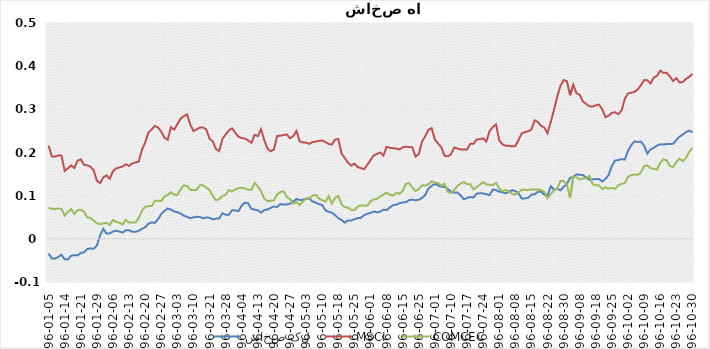
| Category | شاخص کل | MSCI | COMCEC |
|---|---|---|---|
| 1396-01-05 | -0.034 | 0.216 | 0.071 |
| 1396-01-06 | -0.046 | 0.191 | 0.07 |
| 1396-01-07 | -0.046 | 0.19 | 0.069 |
| 1396-01-08 | -0.042 | 0.193 | 0.07 |
| 1396-01-09 | -0.037 | 0.193 | 0.069 |
| 1396-01-14 | -0.047 | 0.157 | 0.054 |
| 1396-01-15 | -0.048 | 0.163 | 0.062 |
| 1396-01-16 | -0.039 | 0.17 | 0.069 |
| 1396-01-19 | -0.038 | 0.164 | 0.058 |
| 1396-01-20 | -0.038 | 0.181 | 0.066 |
| 1396-01-21 | -0.033 | 0.184 | 0.067 |
| 1396-01-23 | -0.031 | 0.171 | 0.063 |
| 1396-01-26 | -0.024 | 0.17 | 0.05 |
| 1396-01-27 | -0.022 | 0.167 | 0.048 |
| 1396-01-28 | -0.023 | 0.159 | 0.042 |
| 1396-01-29 | -0.016 | 0.135 | 0.036 |
| 1396-01-30 | 0.009 | 0.129 | 0.034 |
| 1396-02-02 | 0.023 | 0.142 | 0.036 |
| 1396-02-03 | 0.012 | 0.147 | 0.037 |
| 1396-02-04 | 0.013 | 0.139 | 0.032 |
| 1396-02-06 | 0.017 | 0.157 | 0.044 |
| 1396-02-09 | 0.019 | 0.163 | 0.039 |
| 1396-02-10 | 0.017 | 0.165 | 0.037 |
| 1396-02-11 | 0.014 | 0.167 | 0.033 |
| 1396-02-12 | 0.02 | 0.173 | 0.044 |
| 1396-02-13 | 0.02 | 0.169 | 0.038 |
| 1396-02-16 | 0.016 | 0.175 | 0.038 |
| 1396-02-17 | 0.016 | 0.177 | 0.038 |
| 1396-02-18 | 0.019 | 0.179 | 0.048 |
| 1396-02-19 | 0.023 | 0.206 | 0.065 |
| 1396-02-20 | 0.027 | 0.223 | 0.074 |
| 1396-02-23 | 0.035 | 0.246 | 0.076 |
| 1396-02-24 | 0.038 | 0.254 | 0.076 |
| 1396-02-25 | 0.037 | 0.261 | 0.087 |
| 1396-02-26 | 0.046 | 0.258 | 0.088 |
| 1396-02-27 | 0.057 | 0.248 | 0.087 |
| 1396-02-30 | 0.065 | 0.234 | 0.098 |
| 1396-02-31 | 0.07 | 0.229 | 0.102 |
| 1396-03-01 | 0.068 | 0.259 | 0.108 |
| 1396-03-02 | 0.063 | 0.253 | 0.103 |
| 1396-03-03 | 0.062 | 0.265 | 0.102 |
| 1396-03-06 | 0.059 | 0.278 | 0.115 |
| 1396-03-07 | 0.054 | 0.284 | 0.124 |
| 1396-03-08 | 0.051 | 0.288 | 0.123 |
| 1396-03-09 | 0.048 | 0.265 | 0.114 |
| 1396-03-10 | 0.05 | 0.25 | 0.113 |
| 1396-03-13 | 0.051 | 0.254 | 0.114 |
| 1396-03-16 | 0.051 | 0.258 | 0.124 |
| 1396-03-17 | 0.047 | 0.258 | 0.124 |
| 1396-03-20 | 0.05 | 0.253 | 0.119 |
| 1396-03-21 | 0.049 | 0.232 | 0.113 |
| 1396-03-22 | 0.045 | 0.226 | 0.1 |
| 1396-03-23 | 0.047 | 0.208 | 0.089 |
| 1396-03-24 | 0.047 | 0.203 | 0.092 |
| 1396-03-27 | 0.059 | 0.232 | 0.099 |
| 1396-03-28 | 0.056 | 0.241 | 0.102 |
| 1396-03-29 | 0.056 | 0.251 | 0.113 |
| 1396-03-30 | 0.066 | 0.256 | 0.11 |
| 1396-03-31 | 0.066 | 0.245 | 0.114 |
| 1396-04-03 | 0.064 | 0.236 | 0.117 |
| 1396-04-04 | 0.077 | 0.233 | 0.118 |
| 1396-04-07 | 0.084 | 0.233 | 0.117 |
| 1396-04-10 | 0.082 | 0.228 | 0.114 |
| 1396-04-11 | 0.07 | 0.222 | 0.113 |
| 1396-04-12 | 0.068 | 0.241 | 0.13 |
| 1396-04-13 | 0.066 | 0.238 | 0.121 |
| 1396-04-14 | 0.061 | 0.254 | 0.11 |
| 1396-04-17 | 0.067 | 0.228 | 0.093 |
| 1396-04-18 | 0.068 | 0.209 | 0.087 |
| 1396-04-19 | 0.072 | 0.203 | 0.088 |
| 1396-04-20 | 0.075 | 0.207 | 0.089 |
| 1396-04-21 | 0.074 | 0.238 | 0.103 |
| 1396-04-24 | 0.081 | 0.239 | 0.108 |
| 1396-04-25 | 0.079 | 0.24 | 0.11 |
| 1396-04-26 | 0.08 | 0.242 | 0.097 |
| 1396-04-27 | 0.081 | 0.233 | 0.092 |
| 1396-04-28 | 0.087 | 0.238 | 0.082 |
| 1396-04-31 | 0.092 | 0.25 | 0.085 |
| 1396-05-01 | 0.09 | 0.226 | 0.079 |
| 1396-05-02 | 0.091 | 0.223 | 0.087 |
| 1396-05-03 | 0.092 | 0.223 | 0.093 |
| 1396-05-04 | 0.094 | 0.22 | 0.094 |
| 1396-05-07 | 0.087 | 0.224 | 0.1 |
| 1396-05-08 | 0.084 | 0.225 | 0.102 |
| 1396-05-09 | 0.08 | 0.227 | 0.093 |
| 1396-05-10 | 0.078 | 0.228 | 0.09 |
| 1396-05-11 | 0.066 | 0.224 | 0.086 |
| 1396-05-15 | 0.063 | 0.22 | 0.099 |
| 1396-05-16 | 0.061 | 0.218 | 0.082 |
| 1396-05-17 | 0.055 | 0.23 | 0.095 |
| 1396-05-18 | 0.047 | 0.231 | 0.1 |
| 1396-05-21 | 0.044 | 0.198 | 0.08 |
| 1396-05-22 | 0.038 | 0.187 | 0.074 |
| 1396-05-23 | 0.043 | 0.177 | 0.072 |
| 1396-05-24 | 0.042 | 0.17 | 0.067 |
| 1396-05-25 | 0.045 | 0.174 | 0.067 |
| 1396-05-28 | 0.048 | 0.166 | 0.075 |
| 1396-05-29 | 0.049 | 0.164 | 0.077 |
| 1396-05-30 | 0.055 | 0.161 | 0.077 |
| 1396-05-31 | 0.058 | 0.171 | 0.077 |
| 1396-06-01 | 0.06 | 0.182 | 0.087 |
| 1396-06-04 | 0.063 | 0.193 | 0.091 |
| 1396-06-05 | 0.061 | 0.196 | 0.093 |
| 1396-06-06 | 0.063 | 0.2 | 0.099 |
| 1396-06-07 | 0.068 | 0.193 | 0.102 |
| 1396-06-08 | 0.066 | 0.213 | 0.107 |
| 1396-06-11 | 0.073 | 0.211 | 0.102 |
| 1396-06-12 | 0.078 | 0.21 | 0.1 |
| 1396-06-13 | 0.079 | 0.209 | 0.106 |
| 1396-06-14 | 0.082 | 0.207 | 0.105 |
| 1396-06-15 | 0.084 | 0.212 | 0.111 |
| 1396-06-19 | 0.085 | 0.213 | 0.128 |
| 1396-06-20 | 0.09 | 0.213 | 0.129 |
| 1396-06-21 | 0.091 | 0.212 | 0.118 |
| 1396-06-22 | 0.089 | 0.191 | 0.111 |
| 1396-06-25 | 0.09 | 0.196 | 0.115 |
| 1396-06-26 | 0.095 | 0.225 | 0.124 |
| 1396-06-27 | 0.101 | 0.237 | 0.123 |
| 1396-06-28 | 0.116 | 0.252 | 0.126 |
| 1396-06-29 | 0.123 | 0.256 | 0.133 |
| 1396-07-01 | 0.127 | 0.23 | 0.13 |
| 1396-07-02 | 0.124 | 0.221 | 0.129 |
| 1396-07-03 | 0.121 | 0.212 | 0.124 |
| 1396-07-04 | 0.12 | 0.193 | 0.128 |
| 1396-07-05 | 0.116 | 0.191 | 0.109 |
| 1396-07-10 | 0.109 | 0.196 | 0.106 |
| 1396-07-11 | 0.107 | 0.212 | 0.114 |
| 1396-07-12 | 0.107 | 0.209 | 0.122 |
| 1396-07-15 | 0.101 | 0.207 | 0.128 |
| 1396-07-16 | 0.091 | 0.207 | 0.132 |
| 1396-07-17 | 0.095 | 0.207 | 0.127 |
| 1396-07-18 | 0.097 | 0.22 | 0.126 |
| 1396-07-19 | 0.096 | 0.22 | 0.114 |
| 1396-07-22 | 0.105 | 0.23 | 0.12 |
| 1396-07-23 | 0.106 | 0.231 | 0.126 |
| 1396-07-24 | 0.105 | 0.233 | 0.131 |
| 1396-07-25 | 0.103 | 0.225 | 0.126 |
| 1396-07-26 | 0.101 | 0.25 | 0.125 |
| 1396-07-29 | 0.114 | 0.259 | 0.124 |
| 1396-07-30 | 0.113 | 0.265 | 0.129 |
| 1396-08-01 | 0.109 | 0.228 | 0.117 |
| 1396-08-02 | 0.108 | 0.219 | 0.11 |
| 1396-08-03 | 0.105 | 0.216 | 0.113 |
| 1396-08-06 | 0.109 | 0.215 | 0.109 |
| 1396-08-07 | 0.113 | 0.214 | 0.104 |
| 1396-08-08 | 0.111 | 0.215 | 0.102 |
| 1396-08-09 | 0.105 | 0.229 | 0.108 |
| 1396-08-10 | 0.093 | 0.244 | 0.114 |
| 1396-08-13 | 0.094 | 0.247 | 0.114 |
| 1396-08-14 | 0.095 | 0.249 | 0.113 |
| 1396-08-15 | 0.103 | 0.253 | 0.115 |
| 1396-08-16 | 0.103 | 0.274 | 0.114 |
| 1396-08-17 | 0.109 | 0.271 | 0.114 |
| 1396-08-20 | 0.109 | 0.262 | 0.113 |
| 1396-08-21 | 0.102 | 0.258 | 0.109 |
| 1396-08-22 | 0.1 | 0.245 | 0.094 |
| 1396-08-23 | 0.122 | 0.271 | 0.103 |
| 1396-08-24 | 0.114 | 0.299 | 0.113 |
| 1396-08-27 | 0.116 | 0.329 | 0.116 |
| 1396-08-29 | 0.112 | 0.354 | 0.134 |
| 1396-08-30 | 0.12 | 0.368 | 0.134 |
| 1396-09-01 | 0.127 | 0.365 | 0.127 |
| 1396-09-04 | 0.141 | 0.333 | 0.094 |
| 1396-09-05 | 0.143 | 0.357 | 0.144 |
| 1396-09-07 | 0.149 | 0.337 | 0.143 |
| 1396-09-08 | 0.148 | 0.334 | 0.138 |
| 1396-09-11 | 0.148 | 0.318 | 0.14 |
| 1396-09-12 | 0.142 | 0.313 | 0.141 |
| 1396-09-13 | 0.136 | 0.307 | 0.146 |
| 1396-09-14 | 0.138 | 0.307 | 0.126 |
| 1396-09-18 | 0.139 | 0.309 | 0.124 |
| 1396-09-19 | 0.139 | 0.311 | 0.124 |
| 1396-09-20 | 0.133 | 0.3 | 0.116 |
| 1396-09-21 | 0.139 | 0.282 | 0.119 |
| 1396-09-22 | 0.148 | 0.285 | 0.117 |
| 1396-09-25 | 0.169 | 0.292 | 0.118 |
| 1396-09-26 | 0.181 | 0.293 | 0.116 |
| 1396-09-27 | 0.183 | 0.289 | 0.124 |
| 1396-09-28 | 0.185 | 0.297 | 0.128 |
| 1396-09-29 | 0.183 | 0.324 | 0.129 |
| 1396-10-02 | 0.204 | 0.337 | 0.144 |
| 1396-10-03 | 0.217 | 0.338 | 0.148 |
| 1396-10-04 | 0.226 | 0.341 | 0.149 |
| 1396-10-05 | 0.224 | 0.346 | 0.148 |
| 1396-10-06 | 0.225 | 0.356 | 0.154 |
| 1396-10-09 | 0.216 | 0.368 | 0.168 |
| 1396-10-10 | 0.198 | 0.367 | 0.17 |
| 1396-10-11 | 0.207 | 0.36 | 0.163 |
| 1396-10-12 | 0.211 | 0.374 | 0.162 |
| 1396-10-13 | 0.216 | 0.377 | 0.16 |
| 1396-10-16 | 0.219 | 0.39 | 0.176 |
| 1396-10-17 | 0.218 | 0.384 | 0.184 |
| 1396-10-18 | 0.22 | 0.385 | 0.182 |
| 1396-10-19 | 0.22 | 0.376 | 0.169 |
| 1396-10-20 | 0.22 | 0.365 | 0.166 |
| 1396-10-23 | 0.229 | 0.372 | 0.178 |
| 1396-10-24 | 0.237 | 0.362 | 0.186 |
| 1396-10-25 | 0.242 | 0.363 | 0.18 |
| 1396-10-26 | 0.247 | 0.37 | 0.187 |
| 1396-10-27 | 0.251 | 0.375 | 0.201 |
| 1396-10-30 | 0.246 | 0.382 | 0.211 |